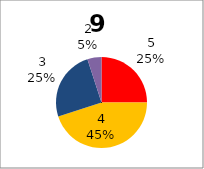
| Category | Series 0 |
|---|---|
| 5.0 | 5 |
| 4.0 | 9 |
| 3.0 | 5 |
| 2.0 | 1 |